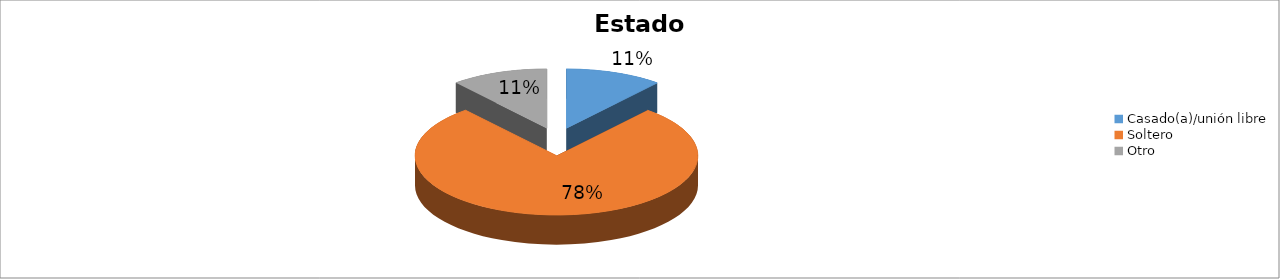
| Category | Series 0 |
|---|---|
| Casado(a)/unión libre | 0.111 |
| Soltero | 0.778 |
| Otro | 0.111 |